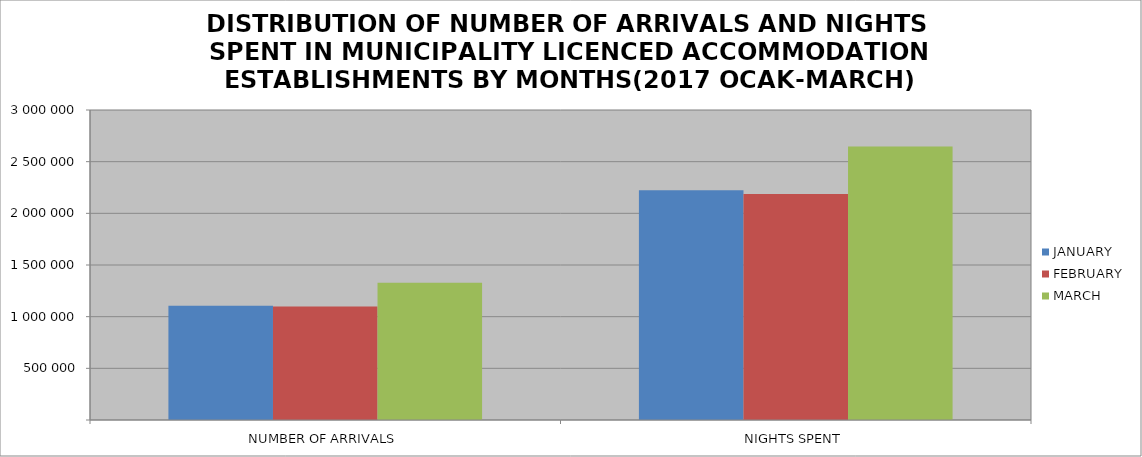
| Category | JANUARY | FEBRUARY | MARCH |
|---|---|---|---|
| NUMBER OF ARRIVALS | 1104649 | 1099366 | 1327993 |
| NIGHTS SPENT | 2222261 | 2187982 | 2645959 |